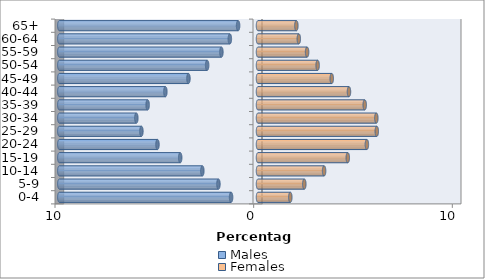
| Category | Males | Females |
|---|---|---|
| 0-4 | -1.355 | 1.626 |
| 5-9 | -1.992 | 2.332 |
| 10-14 | -2.802 | 3.327 |
| 15-19 | -3.916 | 4.52 |
| 20-24 | -5.06 | 5.48 |
| 25-29 | -5.869 | 5.979 |
| 30-34 | -6.124 | 5.957 |
| 35-39 | -5.556 | 5.372 |
| 40-44 | -4.663 | 4.579 |
| 45-49 | -3.501 | 3.712 |
| 50-54 | -2.56 | 3.002 |
| 55-59 | -1.842 | 2.471 |
| 60-64 | -1.417 | 2.054 |
| 65+ | -1.002 | 1.931 |